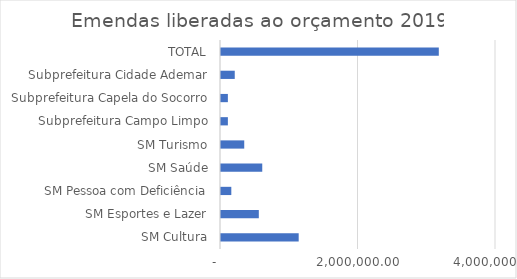
| Category | Series 0 |
|---|---|
| SM Cultura | 1130000 |
| SM Esportes e Lazer | 550000 |
| SM Pessoa com Deficiência | 150000 |
| SM Saúde | 600000 |
| SM Turismo | 338019.65 |
| Subprefeitura Campo Limpo | 100000 |
| Subprefeitura Capela do Socorro | 100000 |
| Subprefeitura Cidade Ademar | 200000 |
| TOTAL | 3168019.65 |